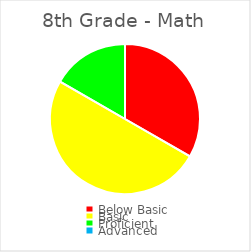
| Category | Series 0 |
|---|---|
| Below Basic | 0.333 |
| Basic | 0.5 |
| Proficient | 0.167 |
| Advanced | 0 |